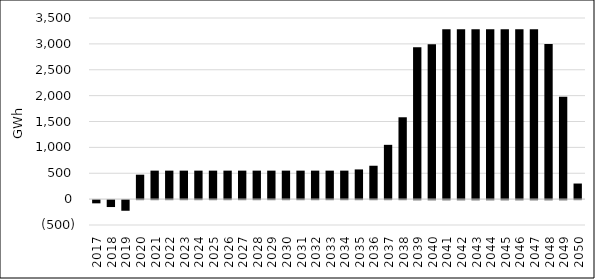
| Category | Change in Wind Energy Output |
|---|---|
| 2017.0 | -61.999 |
| 2018.0 | -133.725 |
| 2019.0 | -205.45 |
| 2020.0 | 472.178 |
| 2021.0 | 550.601 |
| 2022.0 | 550.601 |
| 2023.0 | 550.601 |
| 2024.0 | 550.601 |
| 2025.0 | 550.601 |
| 2026.0 | 550.601 |
| 2027.0 | 550.601 |
| 2028.0 | 550.601 |
| 2029.0 | 550.601 |
| 2030.0 | 550.601 |
| 2031.0 | 550.601 |
| 2032.0 | 550.601 |
| 2033.0 | 550.601 |
| 2034.0 | 550.601 |
| 2035.0 | 573.96 |
| 2036.0 | 645.027 |
| 2037.0 | 1049.165 |
| 2038.0 | 1581.727 |
| 2039.0 | 2932.395 |
| 2040.0 | 2990.752 |
| 2041.0 | 3282.535 |
| 2042.0 | 3282.535 |
| 2043.0 | 3282.535 |
| 2044.0 | 3282.535 |
| 2045.0 | 3282.535 |
| 2046.0 | 3282.535 |
| 2047.0 | 3282.535 |
| 2048.0 | 2998.111 |
| 2049.0 | 1979.261 |
| 2050.0 | 301.324 |